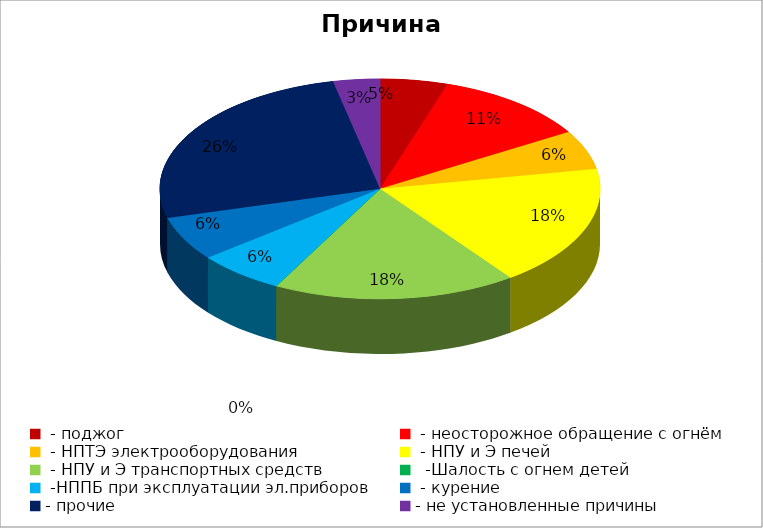
| Category | Причина пожара |
|---|---|
|  - поджог | 13 |
|  - неосторожное обращение с огнём | 30 |
|  - НПТЭ электрооборудования | 15 |
|  - НПУ и Э печей | 47 |
|  - НПУ и Э транспортных средств | 47 |
|   -Шалость с огнем детей | 0 |
|  -НППБ при эксплуатации эл.приборов | 17 |
|  - курение | 17 |
| - прочие | 68 |
| - не установленные причины | 9 |